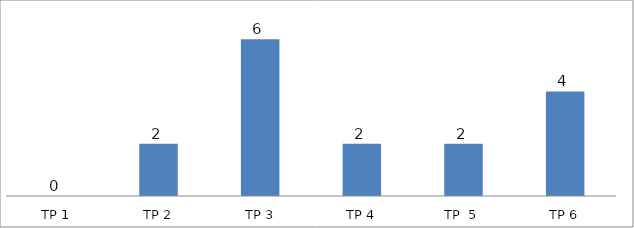
| Category | BIL. MURID |
|---|---|
| TP 1 | 0 |
| TP 2 | 2 |
|  TP 3 | 6 |
| TP 4 | 2 |
| TP  5 | 2 |
| TP 6 | 4 |